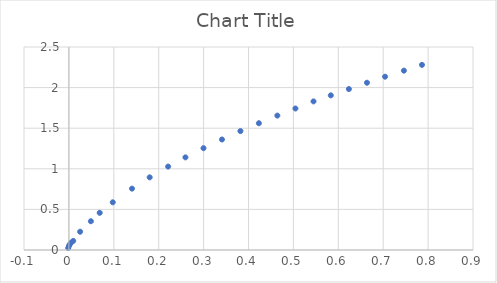
| Category | Series 0 |
|---|---|
| 0.00959912867633028 | 0.112 |
| 0.00446414634907749 | 0.089 |
| 0.00190012383063298 | 0.07 |
| 0.000193550401148795 | 0.05 |
| -0.00151024811218986 | 0.024 |
| 0.0249846512450701 | 0.225 |
| 0.0489377274130497 | 0.354 |
| 0.0686146578008095 | 0.458 |
| 0.0977124285025512 | 0.587 |
| 0.140512735130785 | 0.756 |
| 0.179895732525832 | 0.895 |
| 0.220996403014946 | 1.028 |
| 0.259533050985615 | 1.141 |
| 0.299784597134205 | 1.254 |
| 0.3408963672879 | 1.361 |
| 0.382009524899669 | 1.464 |
| 0.423125457427583 | 1.561 |
| 0.46424277741357 | 1.655 |
| 0.504505423226741 | 1.743 |
| 0.544768069039913 | 1.83 |
| 0.583321366507455 | 1.905 |
| 0.623588174694846 | 1.982 |
| 0.663854982882235 | 2.06 |
| 0.704123178527698 | 2.134 |
| 0.746106272351082 | 2.209 |
| 0.786375855454618 | 2.28 |